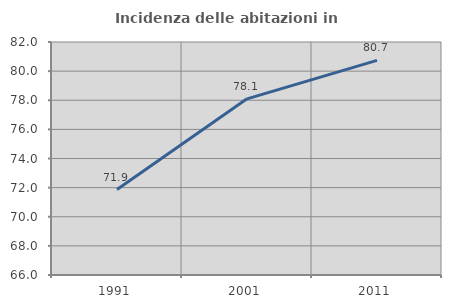
| Category | Incidenza delle abitazioni in proprietà  |
|---|---|
| 1991.0 | 71.866 |
| 2001.0 | 78.098 |
| 2011.0 | 80.741 |